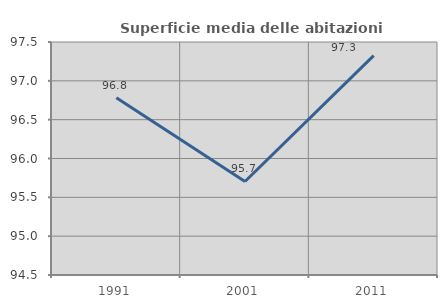
| Category | Superficie media delle abitazioni occupate |
|---|---|
| 1991.0 | 96.781 |
| 2001.0 | 95.704 |
| 2011.0 | 97.324 |